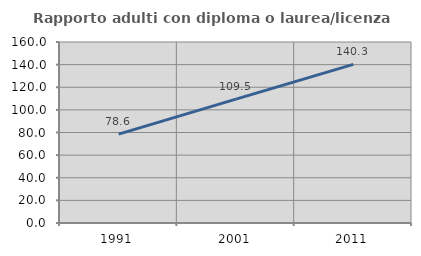
| Category | Rapporto adulti con diploma o laurea/licenza media  |
|---|---|
| 1991.0 | 78.594 |
| 2001.0 | 109.471 |
| 2011.0 | 140.275 |